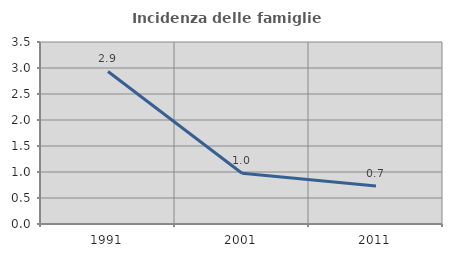
| Category | Incidenza delle famiglie numerose |
|---|---|
| 1991.0 | 2.934 |
| 2001.0 | 0.976 |
| 2011.0 | 0.73 |